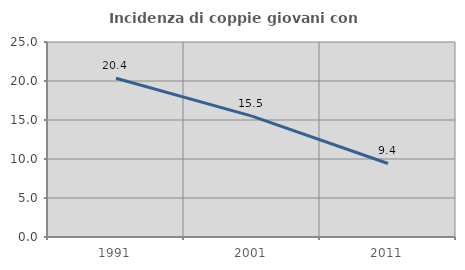
| Category | Incidenza di coppie giovani con figli |
|---|---|
| 1991.0 | 20.357 |
| 2001.0 | 15.498 |
| 2011.0 | 9.425 |